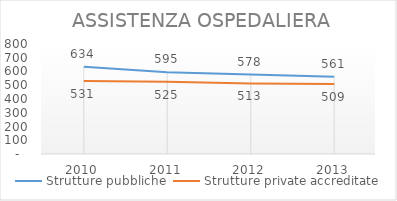
| Category | Strutture pubbliche | Strutture private accreditate |
|---|---|---|
| 2010.0 | 634 | 531 |
| 2011.0 | 595 | 525 |
| 2012.0 | 578 | 513 |
| 2013.0 | 561 | 509 |